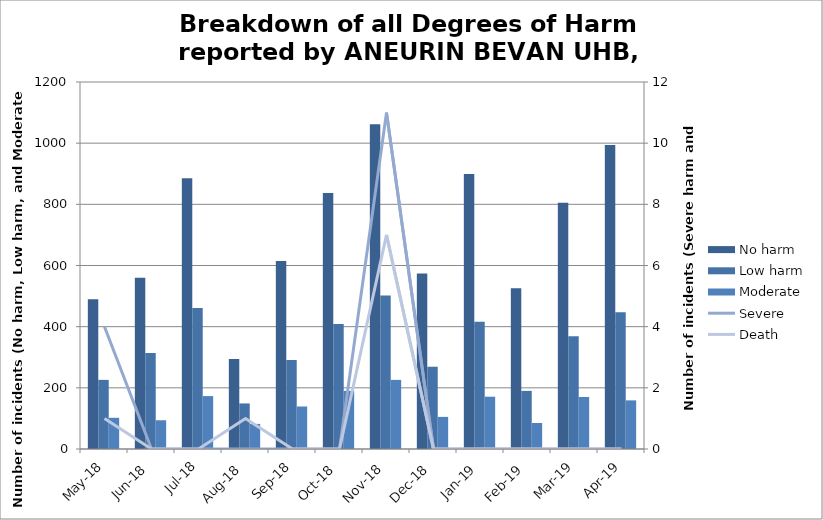
| Category | No harm | Low harm | Moderate |
|---|---|---|---|
| May-18 | 490 | 226 | 102 |
| Jun-18 | 560 | 314 | 94 |
| Jul-18 | 885 | 461 | 173 |
| Aug-18 | 294 | 149 | 82 |
| Sep-18 | 615 | 291 | 139 |
| Oct-18 | 837 | 409 | 190 |
| Nov-18 | 1062 | 502 | 226 |
| Dec-18 | 574 | 269 | 105 |
| Jan-19 | 899 | 416 | 171 |
| Feb-19 | 526 | 190 | 85 |
| Mar-19 | 805 | 369 | 170 |
| Apr-19 | 994 | 447 | 159 |